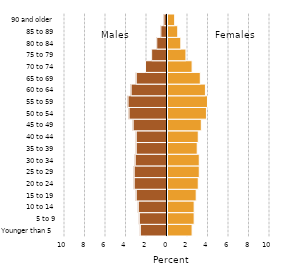
| Category | Female |
|---|---|
| Younger than 5 | 2.4 |
| 5 to 9 | 2.6 |
| 10 to 14 | 2.6 |
| 15 to 19 | 2.8 |
| 20 to 24 | 3 |
| 25 to 29 | 3.1 |
| 30 to 34 | 3.1 |
| 35 to 39 | 2.9 |
| 40 to 44 | 3 |
| 45 to 49 | 3.3 |
| 50 to 54 | 3.8 |
| 55 to 59 | 3.9 |
| 60 to 64 | 3.7 |
| 65 to 69 | 3.2 |
| 70 to 74 | 2.4 |
| 75 to 79 | 1.8 |
| 80 to 84 | 1.3 |
| 85 to 89 | 1 |
| 90 and older | 0.7 |